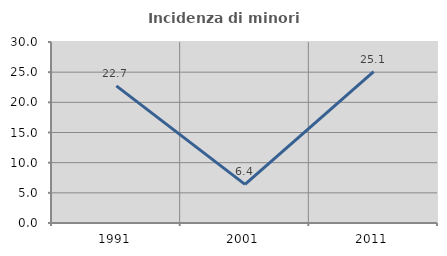
| Category | Incidenza di minori stranieri |
|---|---|
| 1991.0 | 22.727 |
| 2001.0 | 6.41 |
| 2011.0 | 25.105 |